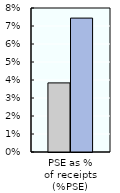
| Category | 2000-02 | 2018-20 |
|---|---|---|
| PSE as %
of receipts (%PSE) | 0.038 | 0.074 |